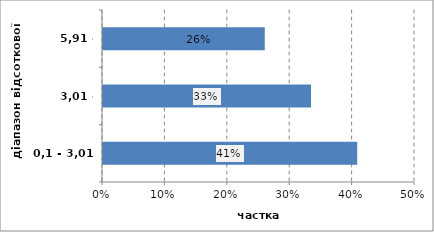
| Category | Series 0 |
|---|---|
| 0,1 - 3,01 | 0.407 |
| 3,01 - 5,91 | 0.333 |
| 5,91 - 8,82 | 0.259 |